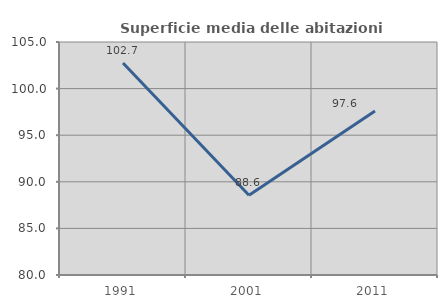
| Category | Superficie media delle abitazioni occupate |
|---|---|
| 1991.0 | 102.746 |
| 2001.0 | 88.562 |
| 2011.0 | 97.586 |